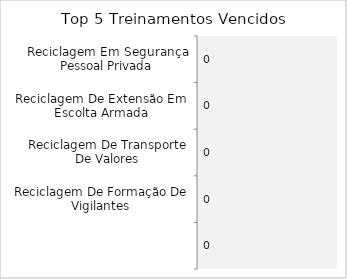
| Category | TOTAL |
|---|---|
| Reciclagem Em Segurança Pessoal Privada | 0 |
| Reciclagem De Extensão Em Escolta Armada | 0 |
| Reciclagem De Transporte De Valores | 0 |
| Reciclagem De Formação De Vigilantes | 0 |